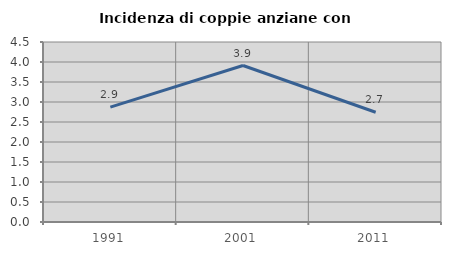
| Category | Incidenza di coppie anziane con figli |
|---|---|
| 1991.0 | 2.872 |
| 2001.0 | 3.912 |
| 2011.0 | 2.743 |